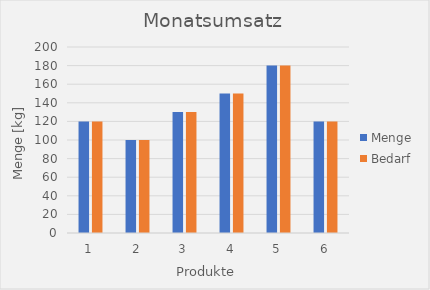
| Category | Menge | Bedarf |
|---|---|---|
| 0 | 120 | 120 |
| 1 | 100 | 100 |
| 2 | 130 | 130 |
| 3 | 150 | 150 |
| 4 | 180 | 180 |
| 5 | 120 | 120 |